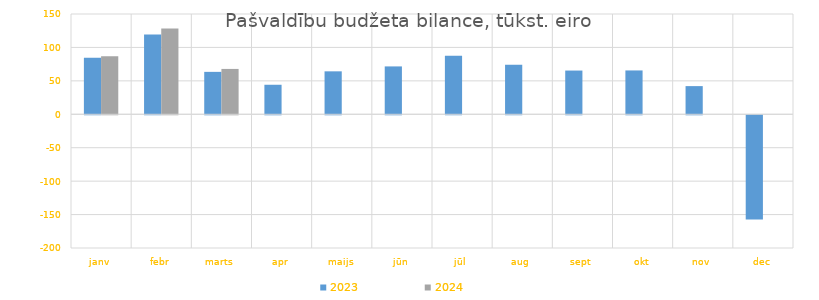
| Category | 2023 | 2024 |
|---|---|---|
| janv | 84479.098 | 86956.73 |
| febr | 119462.892 | 128177.757 |
| marts | 63449.124 | 67846.929 |
| apr | 44164.06 | 0 |
| maijs | 64247.066 | 0 |
| jūn | 71601.894 | 0 |
| jūl | 87551.97 | 0 |
| aug | 74225.888 | 0 |
| sept | 65410.327 | 0 |
| okt | 65576.429 | 0 |
| nov | 42139.59 | 0 |
| dec | -156000.116 | 0 |